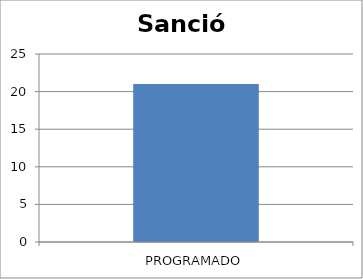
| Category | Sanción |
|---|---|
| PROGRAMADO | 21 |